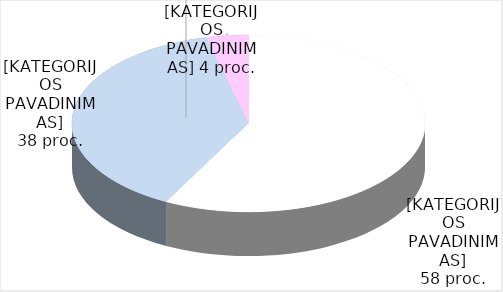
| Category | Series 0 |
|---|---|
| 0 | 15 |
| 1 | 10 |
| 2 | 1 |